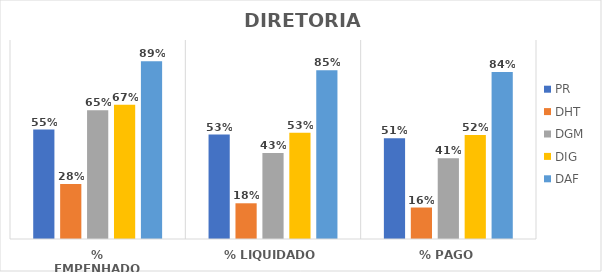
| Category | PR | DHT | DGM | DIG | DAF |
|---|---|---|---|---|---|
| % EMPENHADO | 0.55 | 0.276 | 0.647 | 0.674 | 0.893 |
| % LIQUIDADO | 0.525 | 0.179 | 0.433 | 0.534 | 0.848 |
| % PAGO | 0.506 | 0.158 | 0.406 | 0.522 | 0.839 |